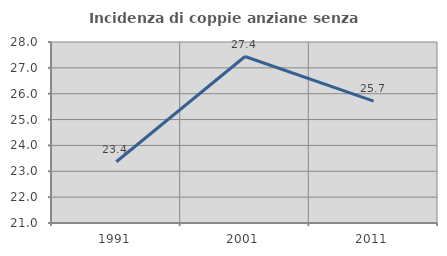
| Category | Incidenza di coppie anziane senza figli  |
|---|---|
| 1991.0 | 23.37 |
| 2001.0 | 27.439 |
| 2011.0 | 25.714 |